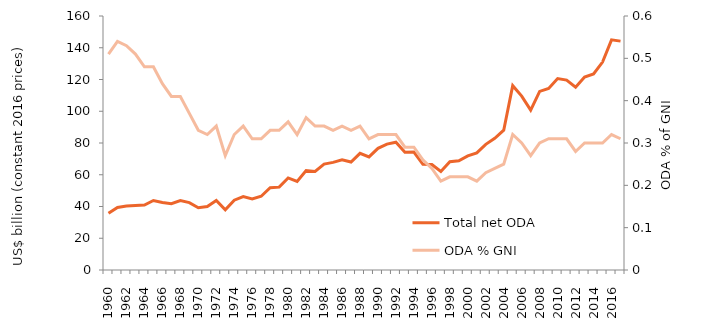
| Category | Total net ODA |
|---|---|
| 1960.0 | 35673.917 |
| 1961.0 | 39410.357 |
| 1962.0 | 40267.227 |
| 1963.0 | 40559.885 |
| 1964.0 | 40926.727 |
| 1965.0 | 43778.007 |
| 1966.0 | 42528.688 |
| 1967.0 | 41783.893 |
| 1968.0 | 43755.819 |
| 1969.0 | 42462.441 |
| 1970.0 | 39249.908 |
| 1971.0 | 39991.183 |
| 1972.0 | 43776.184 |
| 1973.0 | 37893.636 |
| 1974.0 | 43945.296 |
| 1975.0 | 46262.927 |
| 1976.0 | 44797.183 |
| 1977.0 | 46463.97 |
| 1978.0 | 51845.247 |
| 1979.0 | 52192.831 |
| 1980.0 | 57994.428 |
| 1981.0 | 55762.896 |
| 1982.0 | 62664.378 |
| 1983.0 | 62125.148 |
| 1984.0 | 66718.688 |
| 1985.0 | 67771.713 |
| 1986.0 | 69351.101 |
| 1987.0 | 68031.243 |
| 1988.0 | 73496.746 |
| 1989.0 | 71248.761 |
| 1990.0 | 76634.971 |
| 1991.0 | 79322.601 |
| 1992.0 | 80470.111 |
| 1993.0 | 74187.633 |
| 1994.0 | 74326.126 |
| 1995.0 | 66600.639 |
| 1996.0 | 66464.765 |
| 1997.0 | 62065.177 |
| 1998.0 | 68175.097 |
| 1999.0 | 68819.728 |
| 2000.0 | 71907.196 |
| 2001.0 | 73811.483 |
| 2002.0 | 79166.007 |
| 2003.0 | 82974.871 |
| 2004.0 | 88038.758 |
| 2005.0 | 116127.821 |
| 2006.0 | 109556.618 |
| 2007.0 | 100674.615 |
| 2008.0 | 112515.639 |
| 2009.0 | 114318.318 |
| 2010.0 | 120597.828 |
| 2011.0 | 119595.218 |
| 2012.0 | 115138.52 |
| 2013.0 | 121529.154 |
| 2014.0 | 123457.63 |
| 2015.0 | 130989.958 |
| 2016.0 | 144965.08 |
| 2017.0 | 144164.945 |